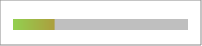
| Category | Series 0 |
|---|---|
| 0 | -0.266 |